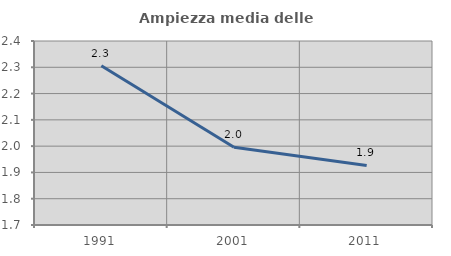
| Category | Ampiezza media delle famiglie |
|---|---|
| 1991.0 | 2.306 |
| 2001.0 | 1.996 |
| 2011.0 | 1.926 |